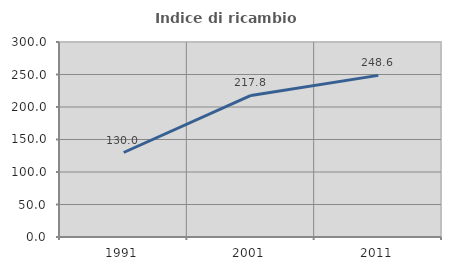
| Category | Indice di ricambio occupazionale  |
|---|---|
| 1991.0 | 130 |
| 2001.0 | 217.778 |
| 2011.0 | 248.649 |